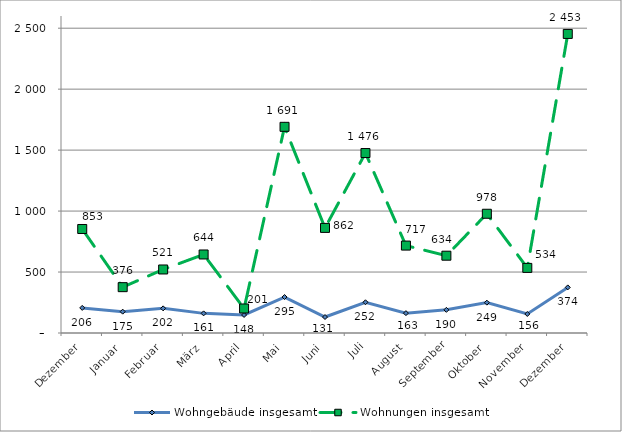
| Category | Wohngebäude insgesamt | Wohnungen insgesamt |
|---|---|---|
| Dezember | 206 | 853 |
| Januar | 175 | 376 |
| Februar | 202 | 521 |
| März | 161 | 644 |
| April | 148 | 201 |
| Mai | 295 | 1691 |
| Juni | 131 | 862 |
| Juli | 252 | 1476 |
| August | 163 | 717 |
| September | 190 | 634 |
| Oktober | 249 | 978 |
| November | 156 | 534 |
| Dezember | 374 | 2453 |